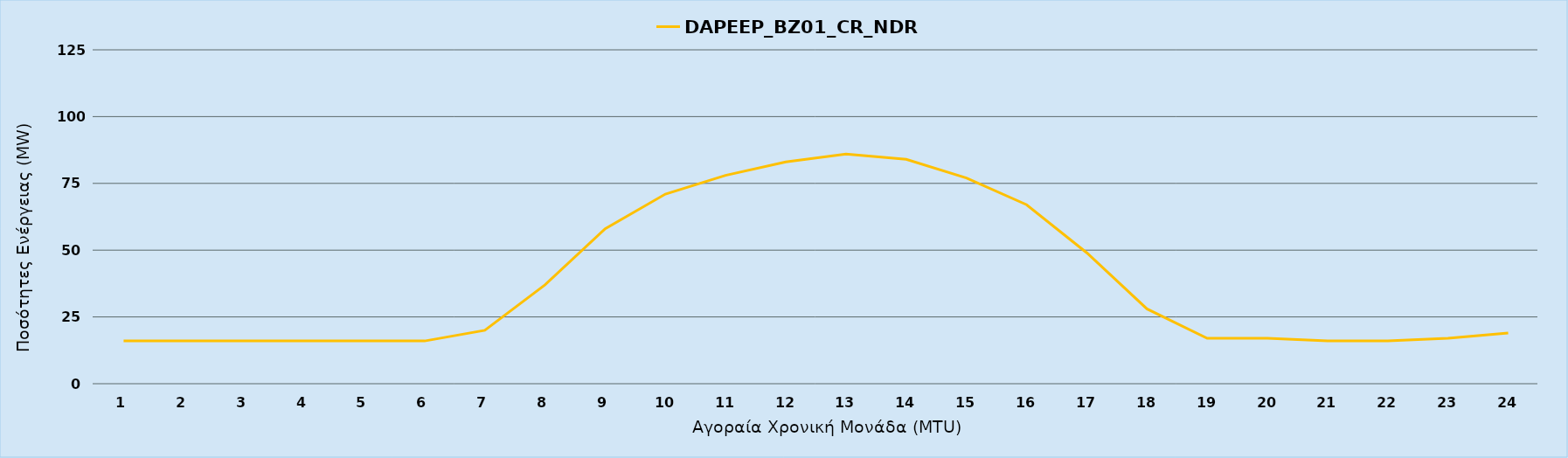
| Category | DAPEEP_BZ01_CR_NDR |
|---|---|
| 0 | 16 |
| 1 | 16 |
| 2 | 16 |
| 3 | 16 |
| 4 | 16 |
| 5 | 16 |
| 6 | 20 |
| 7 | 37 |
| 8 | 58 |
| 9 | 71 |
| 10 | 78 |
| 11 | 83 |
| 12 | 86 |
| 13 | 84 |
| 14 | 77 |
| 15 | 67 |
| 16 | 49 |
| 17 | 28 |
| 18 | 17 |
| 19 | 17 |
| 20 | 16 |
| 21 | 16 |
| 22 | 17 |
| 23 | 19 |